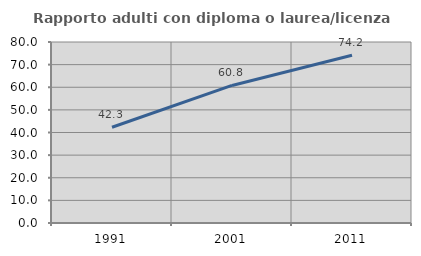
| Category | Rapporto adulti con diploma o laurea/licenza media  |
|---|---|
| 1991.0 | 42.308 |
| 2001.0 | 60.804 |
| 2011.0 | 74.164 |